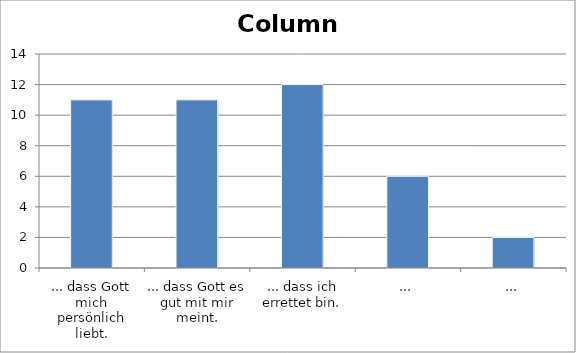
| Category | Series 0 |
|---|---|
| ... dass Gott mich persönlich liebt. | 11 |
| ... dass Gott es gut mit mir meint. | 11 |
| ... dass ich errettet bin. | 12 |
| ... | 6 |
| ... | 2 |